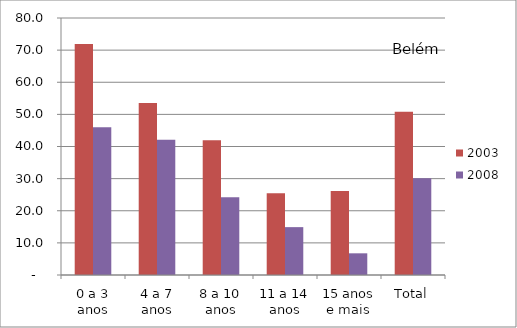
| Category | 2003 | 2008 |
|---|---|---|
| 0 a 3 anos | 71.93 | 46.01 |
| 4 a 7 anos | 53.51 | 42.08 |
| 8 a 10 anos | 41.98 | 24.2 |
| 11 a 14 anos | 25.41 | 14.9 |
| 15 anos e mais | 26.15 | 6.75 |
| Total | 50.83 | 30.12 |